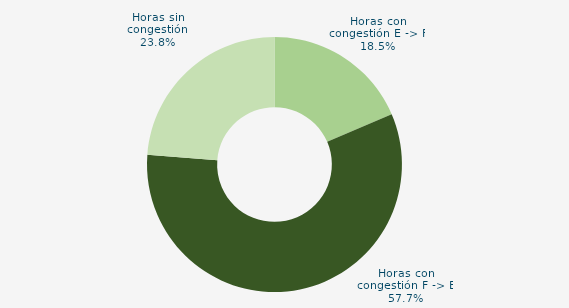
| Category | Horas con congestión E -> F |
|---|---|
| Horas con congestión E -> F | 18.548 |
| Horas con congestión F -> E | 57.661 |
| Horas sin congestión | 23.79 |